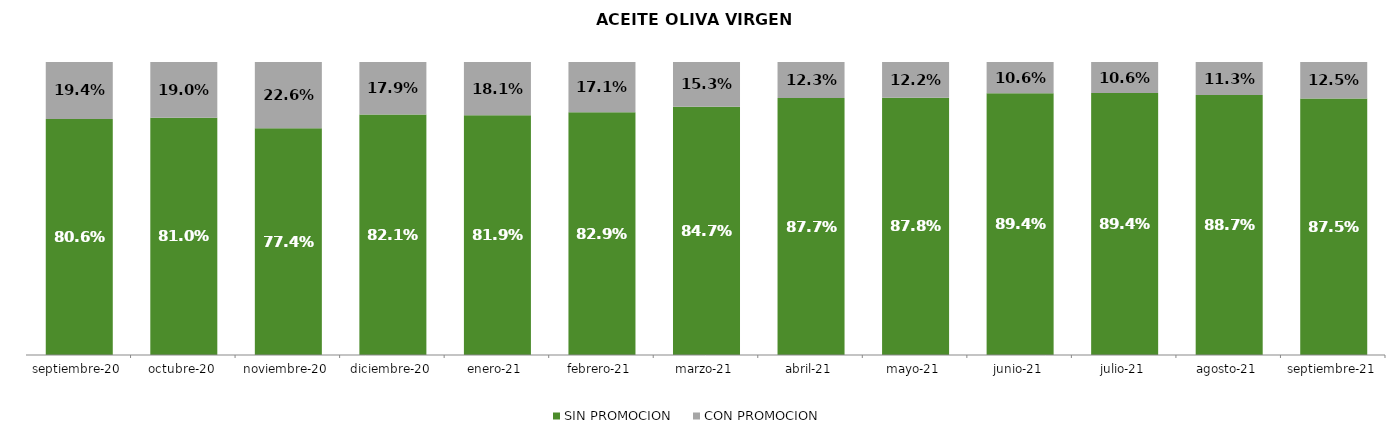
| Category | SIN PROMOCION   | CON PROMOCION   |
|---|---|---|
| 2020-09-01 | 0.806 | 0.194 |
| 2020-10-01 | 0.81 | 0.19 |
| 2020-11-01 | 0.774 | 0.226 |
| 2020-12-01 | 0.821 | 0.179 |
| 2021-01-01 | 0.819 | 0.181 |
| 2021-02-01 | 0.829 | 0.171 |
| 2021-03-01 | 0.847 | 0.153 |
| 2021-04-01 | 0.877 | 0.123 |
| 2021-05-01 | 0.878 | 0.122 |
| 2021-06-01 | 0.894 | 0.106 |
| 2021-07-01 | 0.894 | 0.106 |
| 2021-08-01 | 0.887 | 0.113 |
| 2021-09-01 | 0.875 | 0.125 |